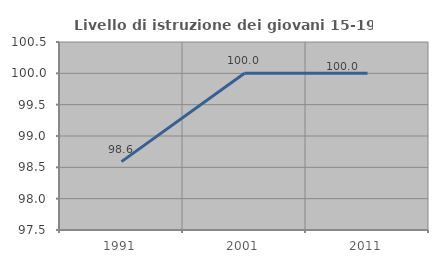
| Category | Livello di istruzione dei giovani 15-19 anni |
|---|---|
| 1991.0 | 98.592 |
| 2001.0 | 100 |
| 2011.0 | 100 |